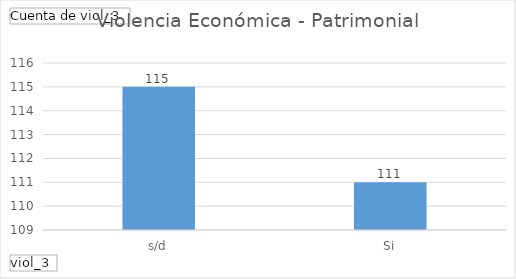
| Category | Total |
|---|---|
| s/d | 115 |
| Si | 111 |